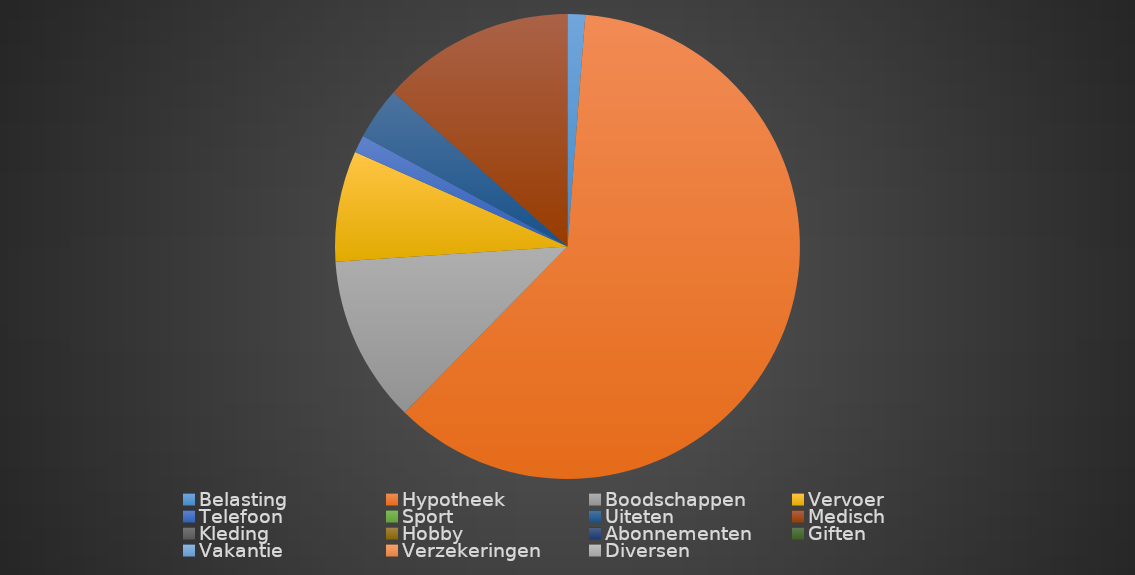
| Category | Series 0 |
|---|---|
| Belasting | 10 |
| Hypotheek | 500 |
| Boodschappen | 95 |
| Vervoer | 63 |
| Telefoon | 10 |
| Sport | 0 |
| Uiteten | 30 |
| Medisch | 110 |
| Kleding | 0 |
| Hobby | 0 |
| Abonnementen | 0 |
| Giften | 0 |
| Vakantie | 0 |
| Verzekeringen | 0 |
| Diversen | 0 |